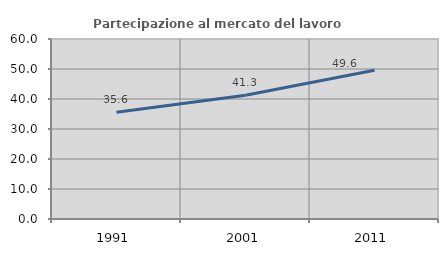
| Category | Partecipazione al mercato del lavoro  femminile |
|---|---|
| 1991.0 | 35.561 |
| 2001.0 | 41.259 |
| 2011.0 | 49.565 |